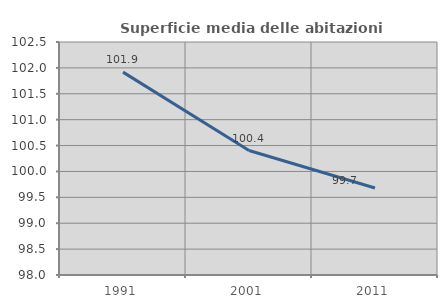
| Category | Superficie media delle abitazioni occupate |
|---|---|
| 1991.0 | 101.918 |
| 2001.0 | 100.404 |
| 2011.0 | 99.68 |